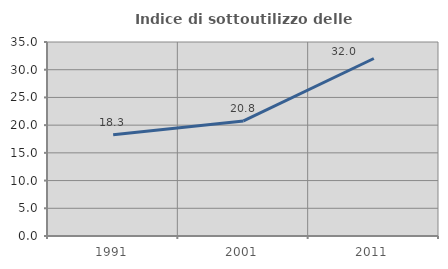
| Category | Indice di sottoutilizzo delle abitazioni  |
|---|---|
| 1991.0 | 18.274 |
| 2001.0 | 20.755 |
| 2011.0 | 32.026 |